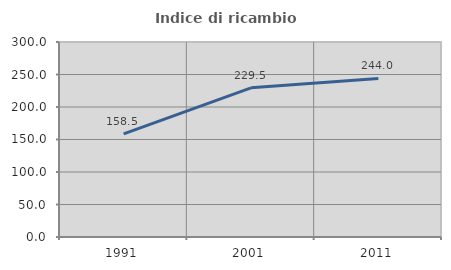
| Category | Indice di ricambio occupazionale  |
|---|---|
| 1991.0 | 158.516 |
| 2001.0 | 229.469 |
| 2011.0 | 243.966 |